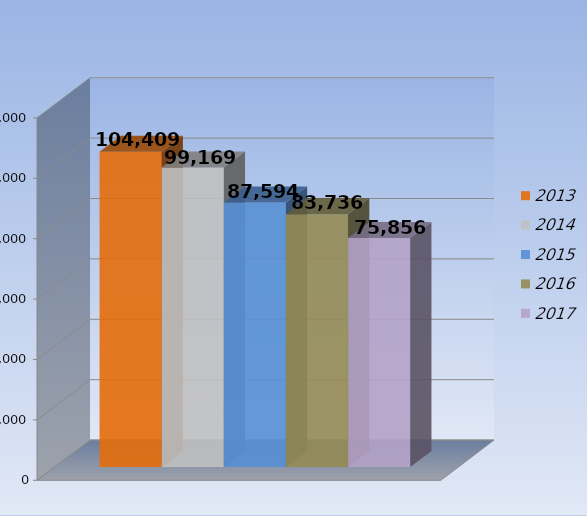
| Category | 2013 | 2014 | 2015 | 2016 | 2017 |
|---|---|---|---|---|---|
| 0 | 104409 | 99169 | 87594 | 83736 | 75856 |